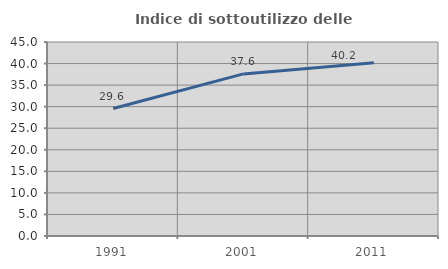
| Category | Indice di sottoutilizzo delle abitazioni  |
|---|---|
| 1991.0 | 29.565 |
| 2001.0 | 37.6 |
| 2011.0 | 40.171 |